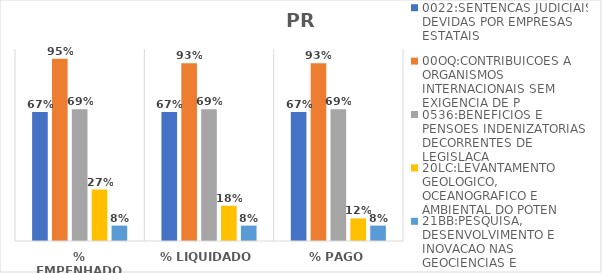
| Category | 0022:SENTENCAS JUDICIAIS DEVIDAS POR EMPRESAS ESTATAIS | 00OQ:CONTRIBUICOES A ORGANISMOS INTERNACIONAIS SEM EXIGENCIA DE P | 0536:BENEFICIOS E PENSOES INDENIZATORIAS DECORRENTES DE LEGISLACA | 20LC:LEVANTAMENTO GEOLOGICO, OCEANOGRAFICO E AMBIENTAL DO POTEN | 21BB:PESQUISA, DESENVOLVIMENTO E INOVACAO NAS GEOCIENCIAS E |
|---|---|---|---|---|---|
| % EMPENHADO | 0.671 | 0.95 | 0.687 | 0.268 | 0.08 |
| % LIQUIDADO | 0.671 | 0.926 | 0.687 | 0.183 | 0.08 |
| % PAGO | 0.671 | 0.926 | 0.687 | 0.118 | 0.08 |